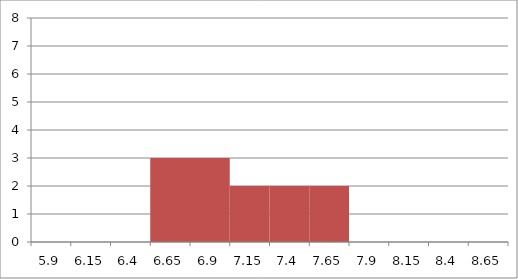
| Category | freq |
|---|---|
| 5.9 | 0 |
| 6.15 | 0 |
| 6.4 | 0 |
| 6.65 | 3 |
| 6.9 | 3 |
| 7.15 | 2 |
| 7.4 | 2 |
| 7.65 | 2 |
| 7.9 | 0 |
| 8.15 | 0 |
| 8.4 | 0 |
| 8.65 | 0 |